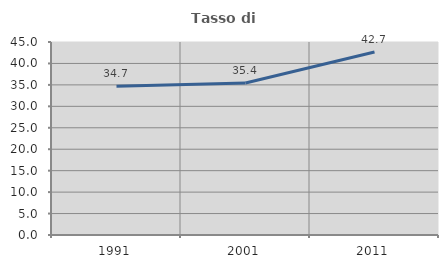
| Category | Tasso di occupazione   |
|---|---|
| 1991.0 | 34.667 |
| 2001.0 | 35.435 |
| 2011.0 | 42.655 |